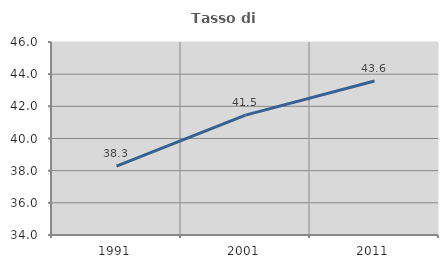
| Category | Tasso di occupazione   |
|---|---|
| 1991.0 | 38.288 |
| 2001.0 | 41.455 |
| 2011.0 | 43.573 |